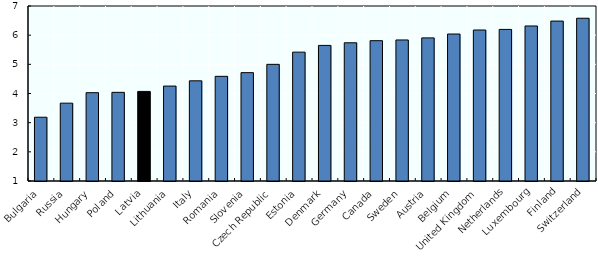
| Category | Series 0 |
|---|---|
| Bulgaria | 3.186 |
| Russia | 3.669 |
| Hungary | 4.028 |
| Poland | 4.039 |
| Latvia | 4.071 |
| Lithuania | 4.255 |
| Italy | 4.435 |
| Romania | 4.588 |
| Slovenia | 4.715 |
| Czech Republic | 5 |
| Estonia | 5.419 |
| Denmark | 5.649 |
| Germany | 5.739 |
| Canada | 5.811 |
| Sweden | 5.835 |
| Austria | 5.907 |
| Belgium | 6.039 |
| United Kingdom | 6.177 |
| Netherlands | 6.197 |
| Luxembourg | 6.315 |
| Finland | 6.483 |
| Switzerland | 6.58 |